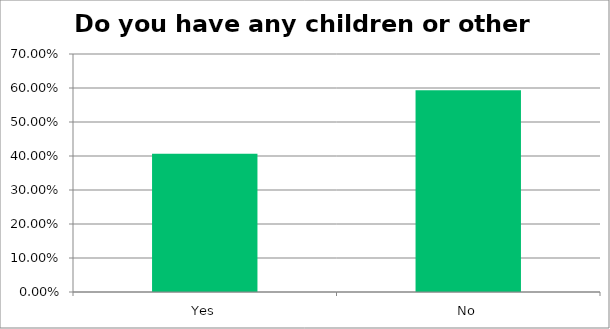
| Category | Responses |
|---|---|
| Yes | 0.406 |
| No | 0.594 |